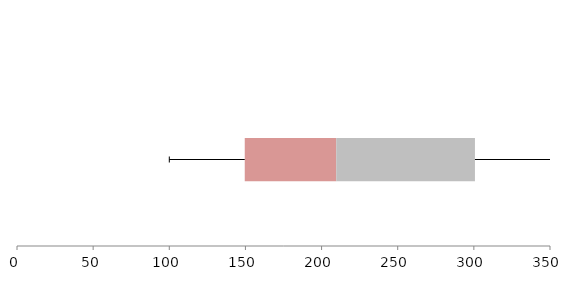
| Category | Series 1 | Series 2 | Series 3 |
|---|---|---|---|
| 0 | 149.553 | 60.08 | 91.086 |